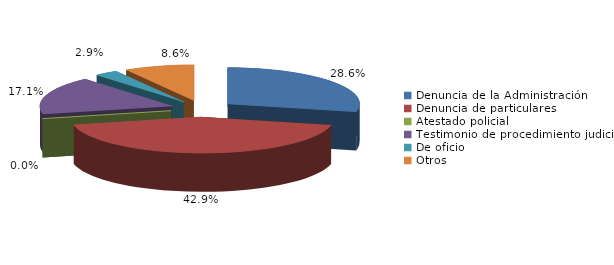
| Category | Series 0 |
|---|---|
| Denuncia de la Administración | 10 |
| Denuncia de particulares | 15 |
| Atestado policial | 0 |
| Testimonio de procedimiento judicial | 6 |
| De oficio | 1 |
| Otros | 3 |